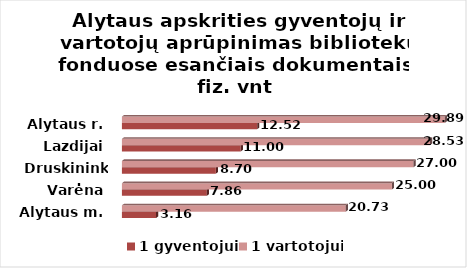
| Category | 1 gyventojui | 1 vartotojui |
|---|---|---|
| Alytaus m. | 3.16 | 20.73 |
| Varėna | 7.86 | 25 |
| Druskininkai | 8.7 | 27 |
| Lazdijai | 11 | 28.53 |
| Alytaus r. | 12.52 | 29.89 |